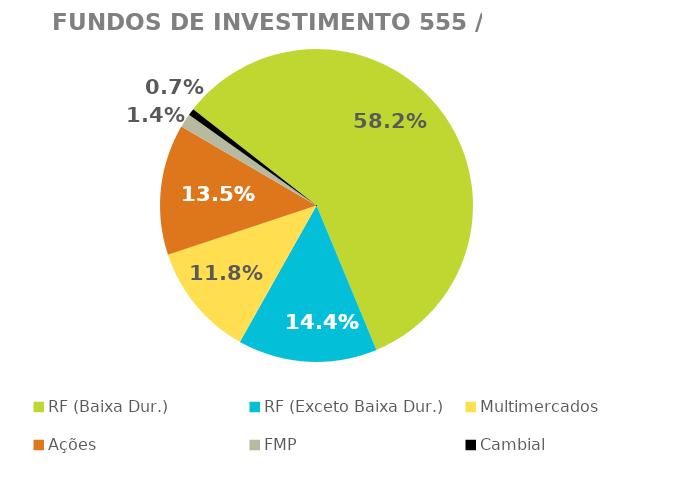
| Category | Fundos de Investimento 555 / FMP |
|---|---|
| RF (Baixa Dur.) | 0.582 |
| RF (Exceto Baixa Dur.) | 0.144 |
| Multimercados | 0.118 |
| Ações | 0.135 |
| FMP | 0.014 |
| Cambial | 0.007 |